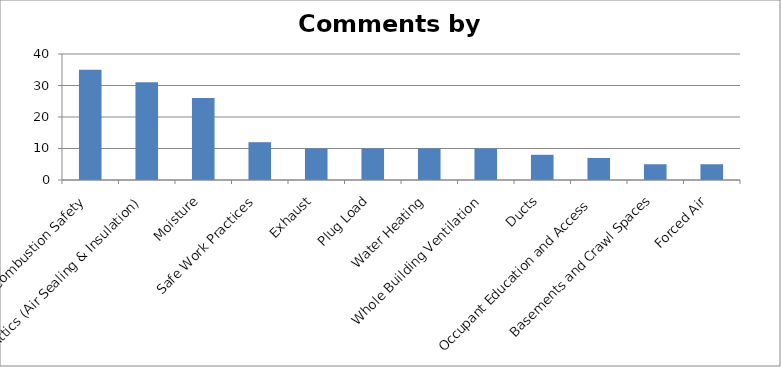
| Category | Count of Submitted By |
|---|---|
| Combustion Safety | 35 |
| Attics (Air Sealing & Insulation) | 31 |
| Moisture | 26 |
| Safe Work Practices | 12 |
| Exhaust | 10 |
| Plug Load | 10 |
| Water Heating | 10 |
| Whole Building Ventilation | 10 |
| Ducts | 8 |
| Occupant Education and Access | 7 |
| Basements and Crawl Spaces | 5 |
| Forced Air | 5 |